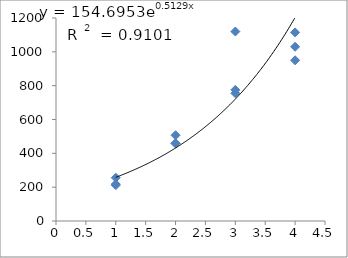
| Category | Series 0 |
|---|---|
| 1.0 | 256 |
| 1.0 | 218 |
| 1.0 | 212 |
| 2.0 | 459 |
| 2.0 | 459 |
| 2.0 | 507 |
| 3.0 | 775 |
| 3.0 | 1120 |
| 3.0 | 755 |
| 4.0 | 1115 |
| 4.0 | 950 |
| 4.0 | 1030 |